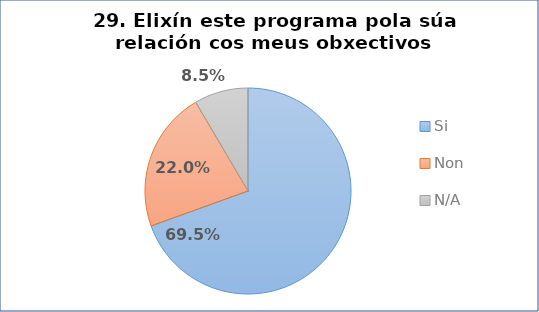
| Category | Pregunta 29. Elixín este programa pola súa relación cos meus obxectivos profesionais |
|---|---|
| Si | 0.695 |
| Non | 0.22 |
| N/A | 0.085 |